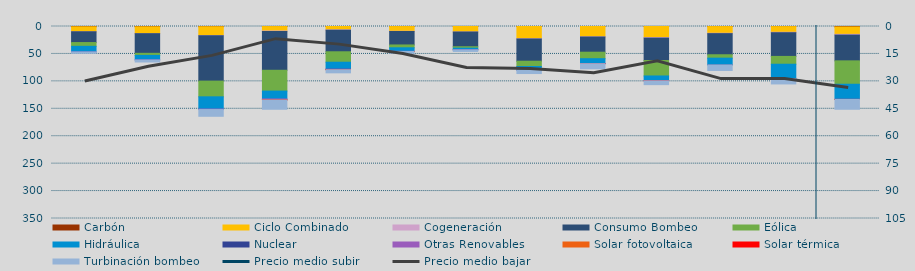
| Category | Carbón | Ciclo Combinado | Cogeneración | Consumo Bombeo | Eólica | Hidráulica | Nuclear | Otras Renovables | Solar fotovoltaica | Solar térmica | Turbinación bombeo |
|---|---|---|---|---|---|---|---|---|---|---|---|
| E | 543.5 | 9049.8 | 14.2 | 19673 | 6854.8 | 10347.8 | 0 | 7.7 | 0 | 0 | 2307.6 |
| F | 538.4 | 12495.4 | 57.7 | 35793.2 | 3820.7 | 8168.3 | 0 | 265.3 | 0 | 0 | 3575.3 |
| M | 386.4 | 15979.9 | 321.7 | 82837 | 28654.5 | 22332.5 | 0 | 917.9 | 0 | 0 | 12258.3 |
| A | 97.2 | 8073.6 | 752.2 | 70876 | 37936.3 | 14340.4 | 0 | 1671.6 | 79.6 | 6.4 | 17035.3 |
| M | 18.3 | 6034.6 | 724.9 | 39295.9 | 19044.2 | 12773.5 | 8 | 691.1 | 39.5 | 82.2 | 5747.6 |
| J | 76.6 | 8592.1 | 398.7 | 24576 | 5144.6 | 6431.8 | 0 | 324 | 34.6 | 38.7 | 3246.7 |
| J | 1 | 9886.9 | 142.6 | 26857.1 | 2569.3 | 2887.6 | 128.7 | 129.9 | 0 | 0 | 2875.8 |
| A | 0.8 | 22172.7 | 585.5 | 40530.6 | 9585.7 | 6785.6 | 0 | 88.9 | 0 | 0 | 6008 |
| S | 48.5 | 18683.2 | 429.6 | 27697.3 | 11818.5 | 8778.9 | 227.5 | 47.7 | 0 | 6.7 | 9356.6 |
| O | 25.6 | 20171.4 | 982.8 | 40815.4 | 28187.3 | 8723.5 | 0 | 22.2 | 0 | 12.6 | 7047.9 |
| N | 99.7 | 12211.6 | 730.7 | 38443.4 | 6217.2 | 12240.5 | 30 | 0 | 0 | 0 | 10182.5 |
| D | 167.6 | 10317.2 | 854.6 | 43195 | 14262.7 | 26583.8 | 0 | 16.9 | 0 | 0 | 9305 |
| E | 832.3 | 13484.6 | 1323.9 | 46979.1 | 42652.2 | 27436.3 | 0 | 295.9 | 0.1 | 23.4 | 17846.5 |